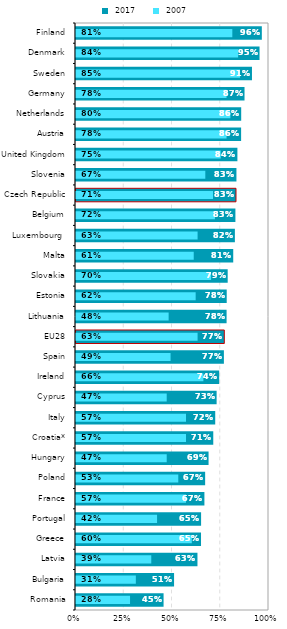
| Category |  2017 |
|---|---|
| Romania | 0.454 |
| Bulgaria | 0.508 |
| Latvia | 0.629 |
| Greece | 0.648 |
| Portugal | 0.648 |
| France | 0.665 |
| Poland | 0.669 |
| Hungary | 0.687 |
| Croatia* | 0.711 |
| Italy | 0.721 |
| Cyprus | 0.729 |
| Ireland | 0.742 |
| Spain | 0.766 |
| EU28 | 0.768 |
| Lithuania | 0.78 |
| Estonia | 0.781 |
| Slovakia | 0.786 |
| Malta | 0.815 |
| Luxembourg  | 0.823 |
| Belgium | 0.826 |
| Czech Republic | 0.829 |
| Slovenia | 0.831 |
| United Kingdom | 0.836 |
| Austria | 0.856 |
| Netherlands | 0.856 |
| Germany | 0.873 |
| Sweden | 0.912 |
| Denmark | 0.951 |
| Finland | 0.963 |